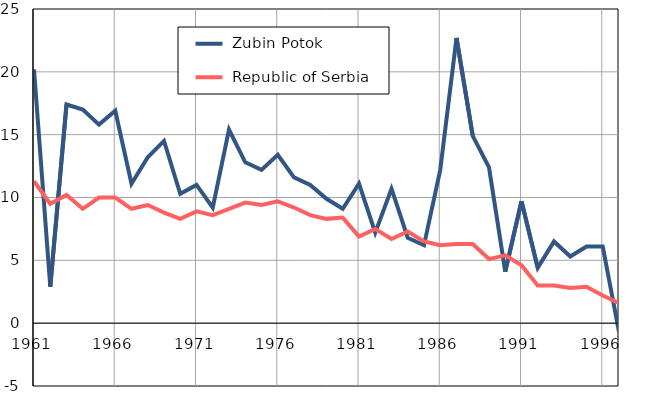
| Category |  Zubin Potok |  Republic of Serbia |
|---|---|---|
| 1961.0 | 20.2 | 11.3 |
| 1962.0 | 2.9 | 9.5 |
| 1963.0 | 17.4 | 10.2 |
| 1964.0 | 17 | 9.1 |
| 1965.0 | 15.8 | 10 |
| 1966.0 | 16.9 | 10 |
| 1967.0 | 11.1 | 9.1 |
| 1968.0 | 13.2 | 9.4 |
| 1969.0 | 14.5 | 8.8 |
| 1970.0 | 10.3 | 8.3 |
| 1971.0 | 11 | 8.9 |
| 1972.0 | 9.2 | 8.6 |
| 1973.0 | 15.4 | 9.1 |
| 1974.0 | 12.8 | 9.6 |
| 1975.0 | 12.2 | 9.4 |
| 1976.0 | 13.4 | 9.7 |
| 1977.0 | 11.6 | 9.2 |
| 1978.0 | 11 | 8.6 |
| 1979.0 | 9.9 | 8.3 |
| 1980.0 | 9.1 | 8.4 |
| 1981.0 | 11.1 | 6.9 |
| 1982.0 | 7.2 | 7.5 |
| 1983.0 | 10.7 | 6.7 |
| 1984.0 | 6.8 | 7.3 |
| 1985.0 | 6.2 | 6.5 |
| 1986.0 | 12.2 | 6.2 |
| 1987.0 | 22.7 | 6.3 |
| 1988.0 | 14.9 | 6.3 |
| 1989.0 | 12.4 | 5.1 |
| 1990.0 | 4.1 | 5.4 |
| 1991.0 | 9.7 | 4.6 |
| 1992.0 | 4.4 | 3 |
| 1993.0 | 6.5 | 3 |
| 1994.0 | 5.3 | 2.8 |
| 1995.0 | 6.1 | 2.9 |
| 1996.0 | 6.1 | 2.2 |
| 1997.0 | -0.7 | 1.6 |